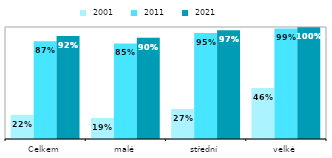
| Category |  2001 |  2011 |  2021 |
|---|---|---|---|
| Celkem | 0.216 | 0.874 | 0.919 |
| malé | 0.187 | 0.854 | 0.904 |
| střední | 0.268 | 0.947 | 0.971 |
| velké | 0.456 | 0.988 | 0.997 |